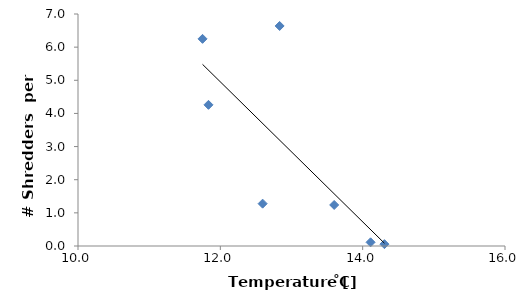
| Category | mean Shred/bag |
|---|---|
| 11.833333333 | 4.259 |
| 11.75 | 6.25 |
| 14.111111111 | 0.111 |
| 12.594444444 | 1.278 |
| 14.305555556 | 0.056 |
| 12.833333333 | 6.639 |
| 13.6 | 1.238 |